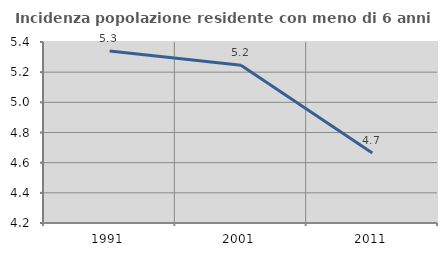
| Category | Incidenza popolazione residente con meno di 6 anni |
|---|---|
| 1991.0 | 5.34 |
| 2001.0 | 5.245 |
| 2011.0 | 4.665 |